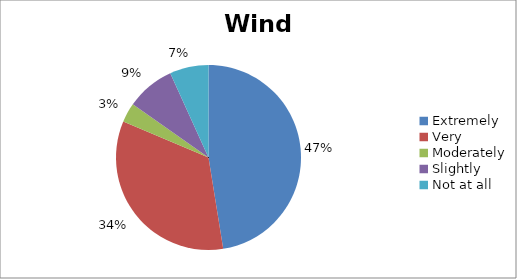
| Category | Wind |
|---|---|
| Extremely | 28 |
| Very | 20 |
| Moderately | 2 |
| Slightly | 5 |
| Not at all | 4 |